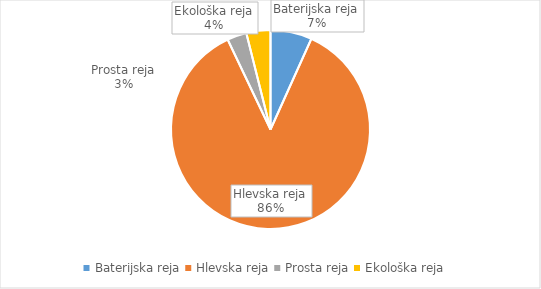
| Category | Količina kosov jajc |
|---|---|
| Baterijska reja | 245839 |
| Hlevska reja | 3145844 |
| Prosta reja | 115505 |
| Ekološka reja | 142860 |